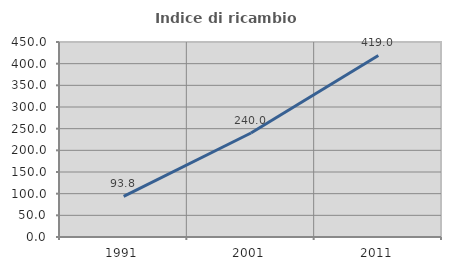
| Category | Indice di ricambio occupazionale  |
|---|---|
| 1991.0 | 93.75 |
| 2001.0 | 240 |
| 2011.0 | 419.048 |